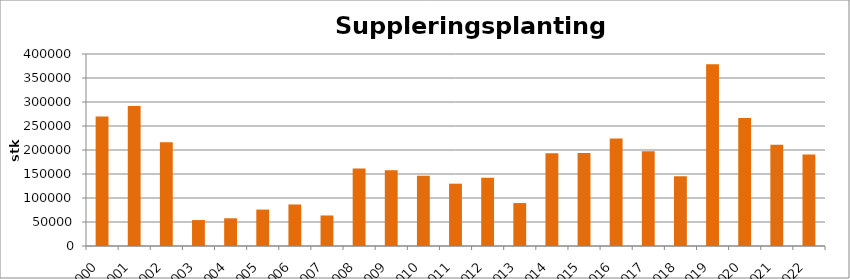
| Category | Totalt |
|---|---|
| 2000 | 269930 |
| 2001 | 291906 |
| 2002 | 215920 |
| 2003 | 54031 |
| 2004 | 57735 |
| 2005 | 75861 |
| 2006 | 86495 |
| 2007 | 63610 |
| 2008 | 161415 |
| 2009 | 157780 |
| 2010 | 146294 |
| 2011 | 129865 |
| 2012 | 141975 |
| 2013 | 89470 |
| 2014 | 193035 |
| 2015 | 193690 |
| 2016 | 224175 |
| 2017 | 197545 |
| 2018 | 145130 |
| 2019 | 378525 |
| 2020 | 266651 |
| 2021 | 211095 |
| 2022 | 190485 |